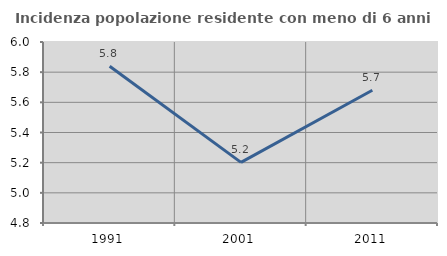
| Category | Incidenza popolazione residente con meno di 6 anni |
|---|---|
| 1991.0 | 5.839 |
| 2001.0 | 5.202 |
| 2011.0 | 5.68 |